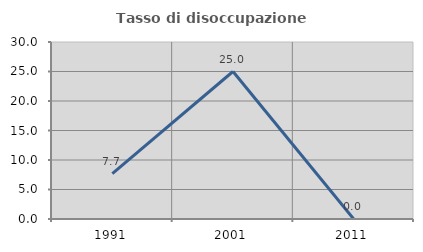
| Category | Tasso di disoccupazione giovanile  |
|---|---|
| 1991.0 | 7.692 |
| 2001.0 | 25 |
| 2011.0 | 0 |